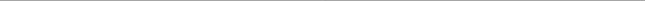
| Category | Series 1 | Series 2 | Series 3 | Series 4 | Series 6 |
|---|---|---|---|---|---|
| 0 | 0 | 0 | 0 | 0 | 0 |
| 1 | 41.667 | 8.333 | 24 | 76 | 16.667 |
| 2 | 20.833 | 8.333 | 12 | 20 | 12.5 |
| 3 | 8.333 | 45.833 | 28 | 4 | 33.333 |
| 4 | 20.833 | 25 | 16 | 0 | 12.5 |
| 5 | 8.333 | 12.5 | 8 | 0 | 4.167 |
| 6 | 0 | 0 | 0 | 0 | 4.167 |
| 7 | 0 | 0 | 0 | 0 | 0 |
| 8 | 0 | 0 | 0 | 0 | 4.167 |
| 9 | 0 | 0 | 0 | 0 | 0 |
| 10 | 0 | 0 | 0 | 0 | 0 |
| 11 | 0 | 0 | 0 | 0 | 0 |
| 12 | 0 | 0 | 0 | 0 | 0 |
| 13 | 0 | 0 | 0 | 0 | 0 |
| 14 | 0 | 0 | 0 | 0 | 0 |
| 15 | 0 | 0 | 12 | 0 | 12.5 |